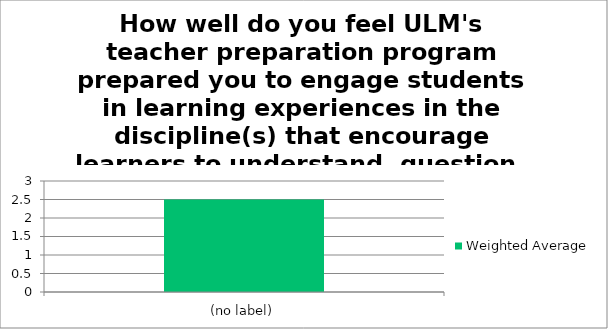
| Category | Weighted Average |
|---|---|
| (no label) | 2.5 |